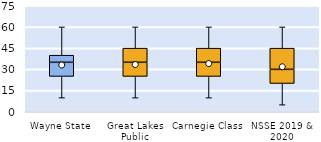
| Category | 25th | 50th | 75th |
|---|---|---|---|
| Wayne State | 25 | 10 | 5 |
| Great Lakes Public | 25 | 10 | 10 |
| Carnegie Class | 25 | 10 | 10 |
| NSSE 2019 & 2020 | 20 | 10 | 15 |